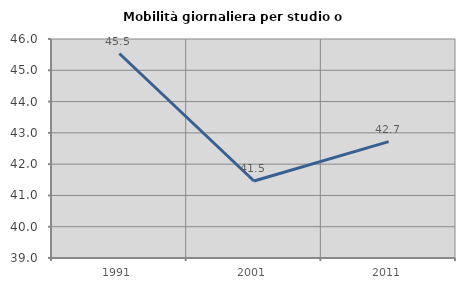
| Category | Mobilità giornaliera per studio o lavoro |
|---|---|
| 1991.0 | 45.536 |
| 2001.0 | 41.461 |
| 2011.0 | 42.72 |